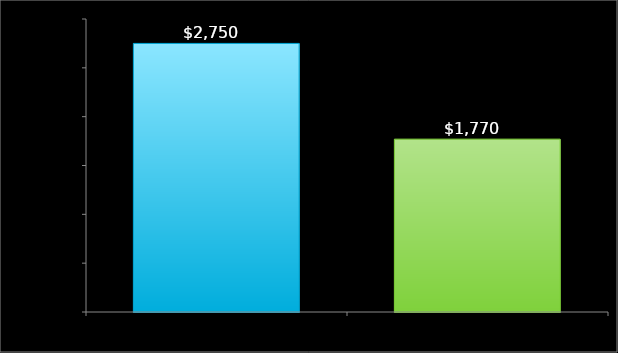
| Category | Data |
|---|---|
| income | 2750 |
| expenses | 1770 |